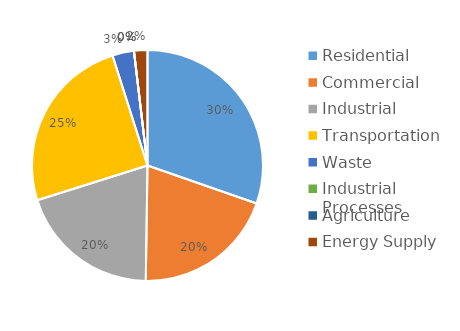
| Category | MTCO2e* |
|---|---|
| Residential | 13634754.77 |
| Commercial | 8948040.643 |
| Industrial | 8948040.643 |
| Transportation | 11218151 |
| Waste | 1357403.11 |
| Industrial Processes | 0 |
| Agriculture | 0 |
| Energy Supply | 844999 |